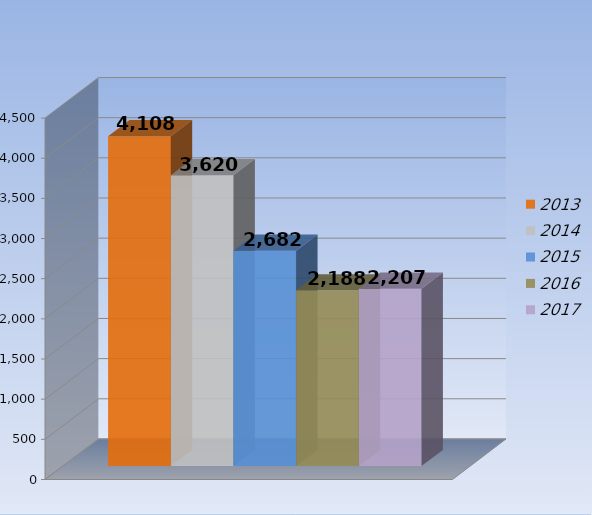
| Category | 2013 | 2014 | 2015 | 2016 | 2017 |
|---|---|---|---|---|---|
| 0 | 4108 | 3620 | 2682 | 2188 | 2207 |